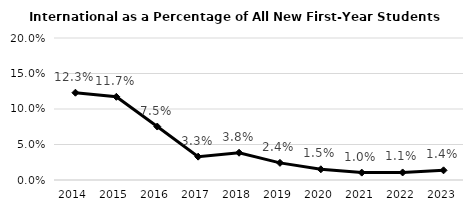
| Category | Series 0 |
|---|---|
| 2014.0 | 0.123 |
| 2015.0 | 0.117 |
| 2016.0 | 0.075 |
| 2017.0 | 0.033 |
| 2018.0 | 0.038 |
| 2019.0 | 0.024 |
| 2020.0 | 0.015 |
| 2021.0 | 0.01 |
| 2022.0 | 0.011 |
| 2023.0 | 0.014 |